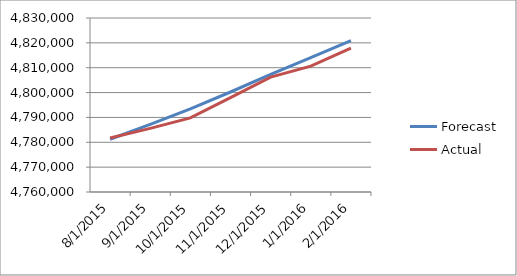
| Category | Forecast | Actual |
|---|---|---|
| 8/1/15 | 4781224.318 | 4781755 |
| 9/1/15 | 4787190.914 | 4785592 |
| 10/1/15 | 4793439.866 | 4789789 |
| 11/1/15 | 4800228.484 | 4797950 |
| 12/1/15 | 4807296.726 | 4806234 |
| 1/1/16 | 4814044.275 | 4810611 |
| 2/1/16 | 4820925.666 | 4817922 |